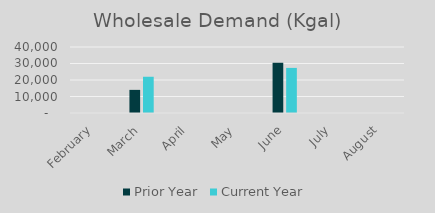
| Category | Prior Year | Current Year |
|---|---|---|
| February | 0 | 0 |
| March | 14013.78 | 21965.02 |
| April | 0 | 0 |
| May | 0 | 0 |
| June | 30443.6 | 27331 |
| July | 0 | 0 |
| August | 0 | 0 |